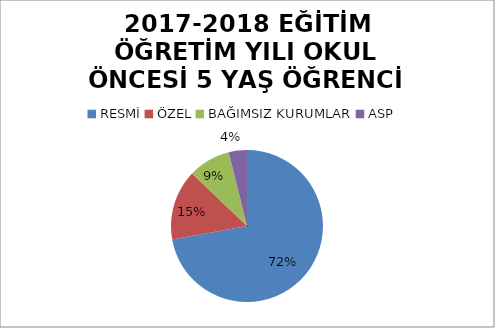
| Category | Series 0 | Series 1 |
|---|---|---|
| RESMİ | 858 |  |
| ÖZEL | 178 |  |
| BAĞIMSIZ KURUMLAR | 107 |  |
| ASP | 46 |  |